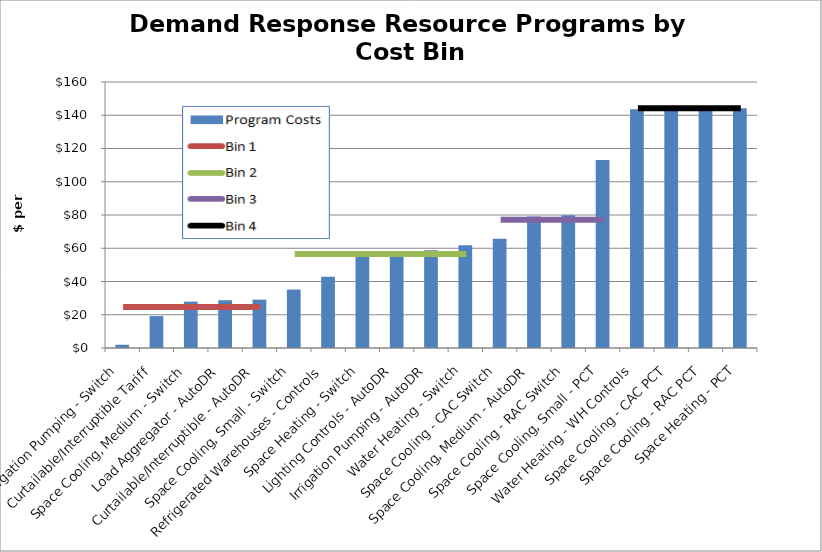
| Category | Series 0 |
|---|---|
| Irrigation Pumping - Switch | 1.943 |
| Curtailable/Interruptible Tariff | 19.202 |
| Space Cooling, Medium - Switch | 27.882 |
| Load Aggregator - AutoDR | 28.723 |
| Curtailable/Interruptible - AutoDR | 29.107 |
| Space Cooling, Small - Switch | 35.15 |
| Refrigerated Warehouses - Controls | 42.821 |
| Space Heating - Switch | 54.963 |
| Lighting Controls - AutoDR | 54.738 |
| Irrigation Pumping - AutoDR | 58.738 |
| Water Heating - Switch | 61.769 |
| Space Cooling - CAC Switch | 65.783 |
| Space Cooling, Medium - AutoDR | 79.128 |
| Space Cooling - RAC Switch | 79.874 |
| Space Cooling, Small - PCT | 113.049 |
| Water Heating - WH Controls | 143.56 |
| Space Cooling - CAC PCT | 144.26 |
| Space Cooling - RAC PCT | 144.26 |
| Space Heating - PCT | 144.26 |